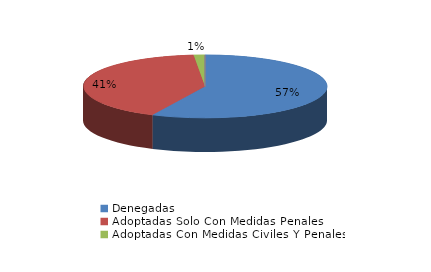
| Category | Series 0 |
|---|---|
| Denegadas | 77 |
| Adoptadas Solo Con Medidas Penales | 56 |
| Adoptadas Con Medidas Civiles Y Penales | 2 |
| Adoptadas Con Medidas Solo Civiles | 0 |